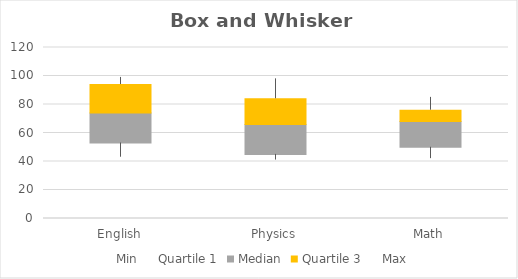
| Category | Min | Quartile 1 | Median | Quartile 3 | Max |
|---|---|---|---|---|---|
| English | 43 | 10 | 21 | 20 | 5 |
| Physics | 41 | 4 | 21 | 18 | 14 |
| Math | 42 | 8 | 18 | 8 | 9 |